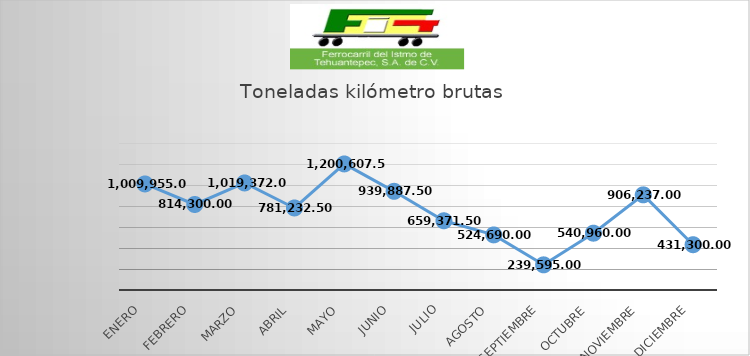
| Category | Series 0 |
|---|---|
| Enero | 1009955 |
| Febrero | 814300 |
| Marzo | 1019372 |
| Abril | 781232.5 |
| Mayo | 1200607.5 |
| Junio | 939887.5 |
| Julio | 659371.5 |
| Agosto | 524690 |
| Septiembre | 239595 |
| Octubre | 540960 |
| Noviembre | 906237 |
| Diciembre | 431300 |